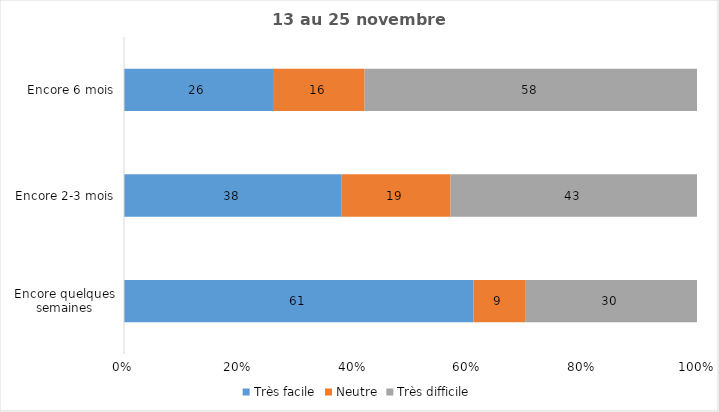
| Category | Très facile | Neutre | Très difficile |
|---|---|---|---|
| Encore quelques semaines | 61 | 9 | 30 |
| Encore 2-3 mois | 38 | 19 | 43 |
| Encore 6 mois | 26 | 16 | 58 |